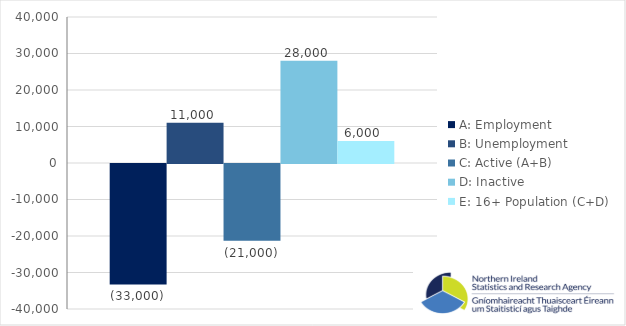
| Category | A: Employment | B: Unemployment | C: Active (A+B) | D: Inactive | E: 16+ Population (C+D) |
|---|---|---|---|---|---|
| 0 | -33000 | 11000 | -21000 | 28000 | 6000 |